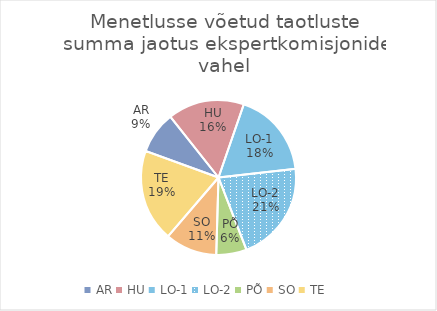
| Category | Series 0 |
|---|---|
| AR | 0.088 |
| HU | 0.16 |
| LO-1 | 0.18 |
| LO-2 | 0.21 |
| PÕ | 0.064 |
| SO | 0.109 |
| TE | 0.193 |